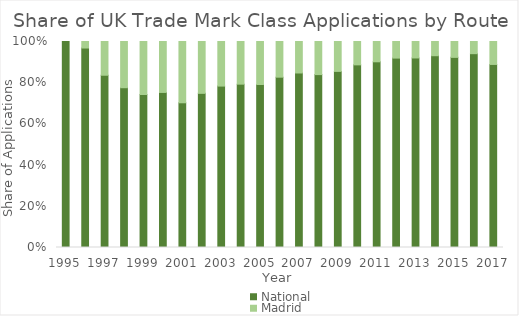
| Category | National | Madrid |
|---|---|---|
| 1995.0 | 1 | 0 |
| 1996.0 | 0.968 | 0.032 |
| 1997.0 | 0.836 | 0.164 |
| 1998.0 | 0.776 | 0.224 |
| 1999.0 | 0.743 | 0.257 |
| 2000.0 | 0.753 | 0.247 |
| 2001.0 | 0.702 | 0.298 |
| 2002.0 | 0.748 | 0.252 |
| 2003.0 | 0.784 | 0.216 |
| 2004.0 | 0.793 | 0.207 |
| 2005.0 | 0.791 | 0.209 |
| 2006.0 | 0.827 | 0.173 |
| 2007.0 | 0.847 | 0.153 |
| 2008.0 | 0.839 | 0.161 |
| 2009.0 | 0.855 | 0.145 |
| 2010.0 | 0.887 | 0.113 |
| 2011.0 | 0.901 | 0.099 |
| 2012.0 | 0.919 | 0.081 |
| 2013.0 | 0.92 | 0.08 |
| 2014.0 | 0.931 | 0.069 |
| 2015.0 | 0.923 | 0.077 |
| 2016.0 | 0.941 | 0.059 |
| 2017.0 | 0.889 | 0.111 |